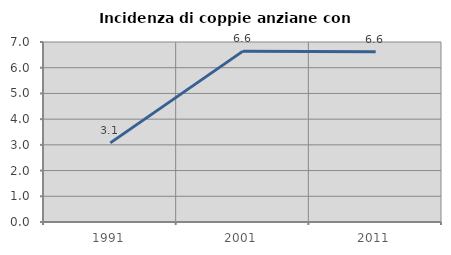
| Category | Incidenza di coppie anziane con figli |
|---|---|
| 1991.0 | 3.077 |
| 2001.0 | 6.645 |
| 2011.0 | 6.618 |